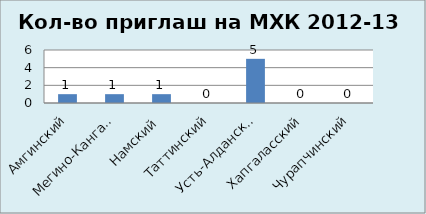
| Category | Series 0 |
|---|---|
| Амгинский | 1 |
| Мегино-Кангаласский | 1 |
| Намский | 1 |
| Таттинский | 0 |
| Усть-Алданский | 5 |
| Хапгаласский | 0 |
| Чурапчинский | 0 |